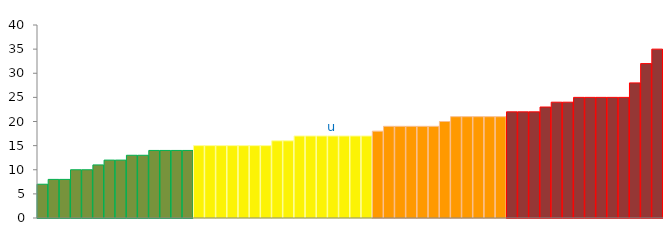
| Category | Top Quartile | 2nd Quartile | 3rd Quartile | Bottom Quartile | Series 4 |
|---|---|---|---|---|---|
|  | 7 | 0 | 0 | 0 | 7 |
|  | 8 | 0 | 0 | 0 | 8 |
|  | 8 | 0 | 0 | 0 | 8 |
|  | 10 | 0 | 0 | 0 | 10 |
|  | 10 | 0 | 0 | 0 | 10 |
|  | 11 | 0 | 0 | 0 | 11 |
|  | 12 | 0 | 0 | 0 | 12 |
|  | 12 | 0 | 0 | 0 | 12 |
|  | 13 | 0 | 0 | 0 | 13 |
|  | 13 | 0 | 0 | 0 | 13 |
|  | 14 | 0 | 0 | 0 | 14 |
|  | 14 | 0 | 0 | 0 | 14 |
|  | 14 | 0 | 0 | 0 | 14 |
|  | 14 | 0 | 0 | 0 | 14 |
|  | 0 | 15 | 0 | 0 | 15 |
|  | 0 | 15 | 0 | 0 | 15 |
|  | 0 | 15 | 0 | 0 | 15 |
|  | 0 | 15 | 0 | 0 | 15 |
|  | 0 | 15 | 0 | 0 | 15 |
|  | 0 | 15 | 0 | 0 | 15 |
|  | 0 | 15 | 0 | 0 | 15 |
|  | 0 | 16 | 0 | 0 | 16 |
|  | 0 | 16 | 0 | 0 | 16 |
|  | 0 | 17 | 0 | 0 | 17 |
|  | 0 | 17 | 0 | 0 | 17 |
|  | 0 | 17 | 0 | 0 | 17 |
| u | 0 | 17 | 0 | 0 | 17 |